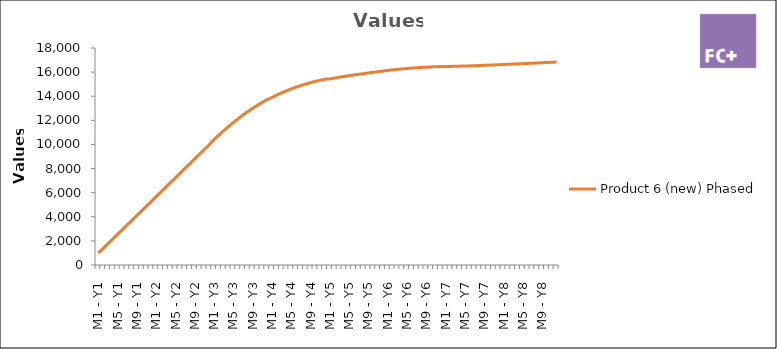
| Category | Product 6 (new) Phased |
|---|---|
| M1 - Y1 | 1001.266 |
| M2 - Y1 | 1391.57 |
| M3 - Y1 | 1781.621 |
| M4 - Y1 | 2171.474 |
| M5 - Y1 | 2561.186 |
| M6 - Y1 | 2950.813 |
| M7 - Y1 | 3340.412 |
| M8 - Y1 | 3730.04 |
| M9 - Y1 | 4119.752 |
| M10 - Y1 | 4509.605 |
| M11 - Y1 | 4899.655 |
| M12 - Y1 | 5289.96 |
| M1 - Y2 | 5682.349 |
| M2 - Y2 | 6073.452 |
| M3 - Y2 | 6464.979 |
| M4 - Y2 | 6856.986 |
| M5 - Y2 | 7249.529 |
| M6 - Y2 | 7642.665 |
| M7 - Y2 | 8036.419 |
| M8 - Y2 | 8430.118 |
| M9 - Y2 | 8822.388 |
| M10 - Y2 | 9211.823 |
| M11 - Y2 | 9597.02 |
| M12 - Y2 | 9976.574 |
| M1 - Y3 | 10421.365 |
| M2 - Y3 | 10787.961 |
| M3 - Y3 | 11144.632 |
| M4 - Y3 | 11489.963 |
| M5 - Y3 | 11822.54 |
| M6 - Y3 | 12140.947 |
| M7 - Y3 | 12443.81 |
| M8 - Y3 | 12730.61 |
| M9 - Y3 | 13001.695 |
| M10 - Y3 | 13257.446 |
| M11 - Y3 | 13498.246 |
| M12 - Y3 | 13724.478 |
| M1 - Y4 | 13898.64 |
| M2 - Y4 | 14096.345 |
| M3 - Y4 | 14280.667 |
| M4 - Y4 | 14451.986 |
| M5 - Y4 | 14610.686 |
| M6 - Y4 | 14757.147 |
| M7 - Y4 | 14891.761 |
| M8 - Y4 | 15015.159 |
| M9 - Y4 | 15128.205 |
| M10 - Y4 | 15231.776 |
| M11 - Y4 | 15326.75 |
| M12 - Y4 | 15414.002 |
| M1 - Y5 | 15435.383 |
| M2 - Y5 | 15509.54 |
| M3 - Y5 | 15578.624 |
| M4 - Y5 | 15643.51 |
| M5 - Y5 | 15705.071 |
| M6 - Y5 | 15764.179 |
| M7 - Y5 | 15821.687 |
| M8 - Y5 | 15877.928 |
| M9 - Y5 | 15932.721 |
| M10 - Y5 | 15985.863 |
| M11 - Y5 | 16037.151 |
| M12 - Y5 | 16086.379 |
| M1 - Y6 | 16140.071 |
| M2 - Y6 | 16184.59 |
| M3 - Y6 | 16226.438 |
| M4 - Y6 | 16265.412 |
| M5 - Y6 | 16301.308 |
| M6 - Y6 | 16333.921 |
| M7 - Y6 | 16363.061 |
| M8 - Y6 | 16388.814 |
| M9 - Y6 | 16411.545 |
| M10 - Y6 | 16431.631 |
| M11 - Y6 | 16449.448 |
| M12 - Y6 | 16465.374 |
| M1 - Y7 | 16457.3 |
| M2 - Y7 | 16470.556 |
| M3 - Y7 | 16483.052 |
| M4 - Y7 | 16495.165 |
| M5 - Y7 | 16507.271 |
| M6 - Y7 | 16519.746 |
| M7 - Y7 | 16532.958 |
| M8 - Y7 | 16547.056 |
| M9 - Y7 | 16561.971 |
| M10 - Y7 | 16577.626 |
| M11 - Y7 | 16593.942 |
| M12 - Y7 | 16610.843 |
| M1 - Y8 | 16631.822 |
| M2 - Y8 | 16649.66 |
| M3 - Y8 | 16667.849 |
| M4 - Y8 | 16686.31 |
| M5 - Y8 | 16704.966 |
| M6 - Y8 | 16723.739 |
| M7 - Y8 | 16742.55 |
| M8 - Y8 | 16761.323 |
| M9 - Y8 | 16779.979 |
| M10 - Y8 | 16798.44 |
| M11 - Y8 | 16816.629 |
| M12 - Y8 | 16834.467 |